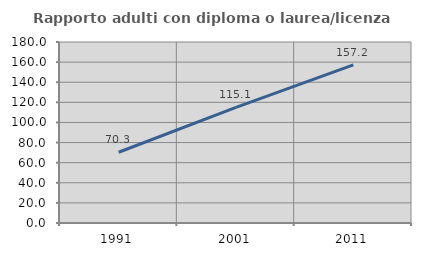
| Category | Rapporto adulti con diploma o laurea/licenza media  |
|---|---|
| 1991.0 | 70.347 |
| 2001.0 | 115.062 |
| 2011.0 | 157.208 |